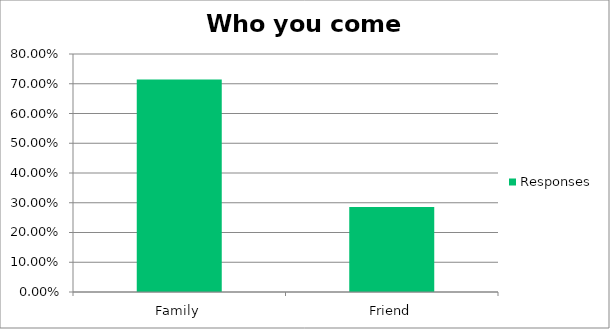
| Category | Responses |
|---|---|
| Family | 0.714 |
| Friend | 0.286 |